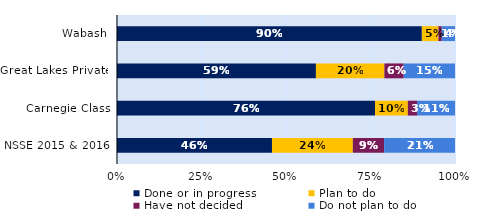
| Category | Done or in progress | Plan to do | Have not decided | Do not plan to do |
|---|---|---|---|---|
| Wabash | 0.902 | 0.049 | 0.01 | 0.039 |
| Great Lakes Private | 0.589 | 0.202 | 0.057 | 0.152 |
| Carnegie Class | 0.763 | 0.097 | 0.027 | 0.112 |
| NSSE 2015 & 2016 | 0.459 | 0.239 | 0.093 | 0.21 |